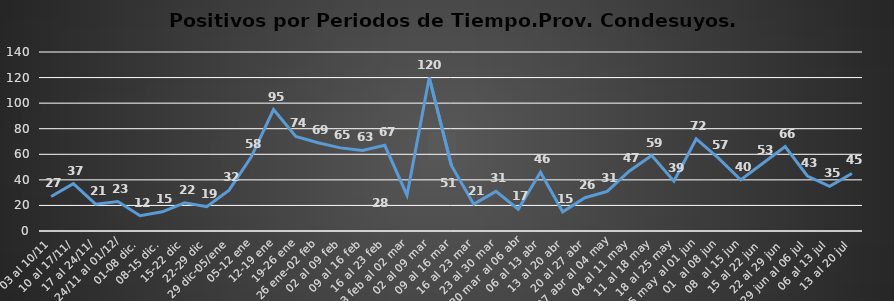
| Category | Prov. Condesuy |
|---|---|
| 03 al 10/11 | 27 |
| 10 al 17/11/ | 37 |
|  17 al 24/11/ | 21 |
|  24/11 al 01/12/ | 23 |
| 01-08 dic. | 12 |
| 08-15 dic. | 15 |
| 15-22 dic | 22 |
| 22-29 dic | 19 |
| 29 dic-05/ene | 32 |
| 05-12 ene | 58 |
| 12-19 ene | 95 |
| 19-26 ene | 74 |
| 26 ene-02 feb | 69 |
| 02 al 09 feb | 65 |
| 09 al 16 feb | 63 |
| 16 al 23 feb | 67 |
| 23 feb al 02 mar | 28 |
|  02 al 09 mar | 120 |
|  09 al 16 mar | 51 |
|  16 al 23 mar | 21 |
|  23 al 30 mar | 31 |
|  30 mar al 06 abr | 17 |
| 06 al 13 abr | 46 |
| 13 al 20 abr | 15 |
| 20 al 27 abr | 26 |
| 27 abr al 04 may | 31 |
|  04 al 11 may | 47 |
|  11 al 18 may | 59 |
|  18 al 25 may | 39 |
|  25 may al 01 jun | 72 |
|  01  al 08 jun | 57 |
|  08  al 15 jun | 40 |
|  15 al 22 jun  | 53 |
|  22 al 29 jun  | 66 |
|   29 jun al 06 jul  | 43 |
|    06 al 13 jul  | 35 |
|    13 al 20 jul  | 45 |